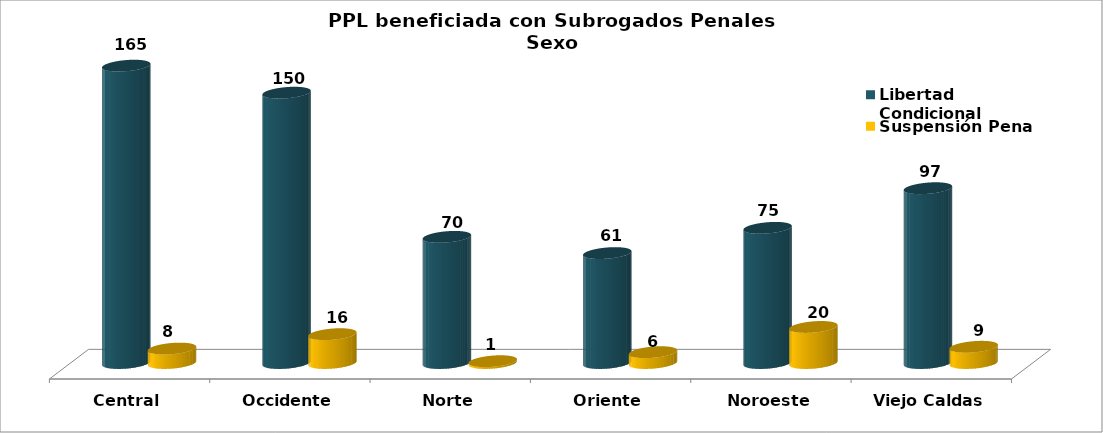
| Category | Libertad Condicional | Suspensión Pena |
|---|---|---|
| Central | 165 | 8 |
| Occidente | 150 | 16 |
| Norte | 70 | 1 |
| Oriente | 61 | 6 |
| Noroeste | 75 | 20 |
| Viejo Caldas | 97 | 9 |